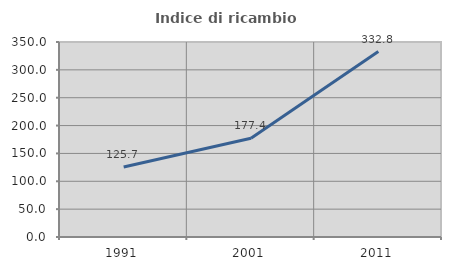
| Category | Indice di ricambio occupazionale  |
|---|---|
| 1991.0 | 125.661 |
| 2001.0 | 177.365 |
| 2011.0 | 332.773 |